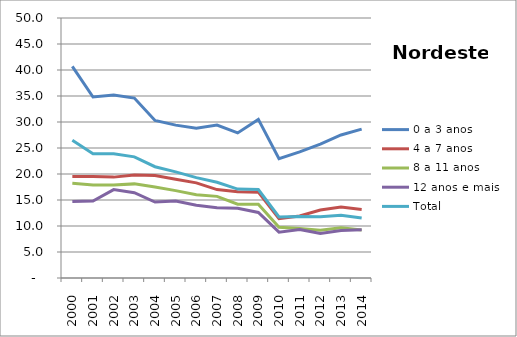
| Category | 0 a 3 anos | 4 a 7 anos | 8 a 11 anos | 12 anos e mais | Total |
|---|---|---|---|---|---|
| 2000.0 | 40.7 | 19.5 | 18.2 | 14.7 | 26.5 |
| 2001.0 | 34.8 | 19.5 | 17.9 | 14.8 | 23.9 |
| 2002.0 | 35.2 | 19.4 | 17.9 | 17 | 23.9 |
| 2003.0 | 34.6 | 19.8 | 18.1 | 16.4 | 23.3 |
| 2004.0 | 30.3 | 19.7 | 17.5 | 14.6 | 21.4 |
| 2005.0 | 29.4 | 19 | 16.8 | 14.8 | 20.4 |
| 2006.0 | 28.8 | 18.3 | 16 | 14 | 19.3 |
| 2007.0 | 29.4 | 17 | 15.7 | 13.5 | 18.4 |
| 2008.0 | 27.9 | 16.6 | 14.2 | 13.4 | 17.1 |
| 2009.0 | 30.5 | 16.5 | 14.2 | 12.6 | 17 |
| 2010.0 | 22.942 | 11.42 | 9.743 | 8.82 | 11.746 |
| 2011.0 | 24.241 | 11.913 | 9.497 | 9.308 | 11.836 |
| 2012.0 | 25.754 | 13.079 | 9.164 | 8.544 | 11.77 |
| 2013.0 | 27.512 | 13.656 | 9.655 | 9.117 | 12.086 |
| 2014.0 | 28.639 | 13.194 | 9.234 | 9.257 | 11.539 |